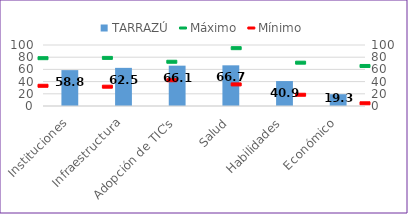
| Category | TARRAZÚ |
|---|---|
| Instituciones | 58.817 |
| Infraestructura | 62.529 |
| Adopción de TIC's | 66.139 |
| Salud | 66.69 |
| Habilidades | 40.861 |
| Económico | 19.327 |